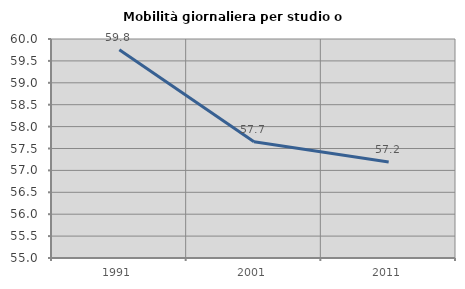
| Category | Mobilità giornaliera per studio o lavoro |
|---|---|
| 1991.0 | 59.757 |
| 2001.0 | 57.654 |
| 2011.0 | 57.194 |